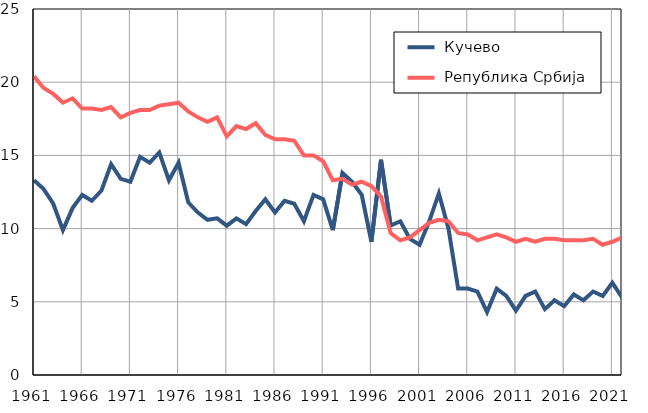
| Category |  Кучево |  Република Србија |
|---|---|---|
| 1961.0 | 13.3 | 20.4 |
| 1962.0 | 12.7 | 19.6 |
| 1963.0 | 11.7 | 19.2 |
| 1964.0 | 9.9 | 18.6 |
| 1965.0 | 11.4 | 18.9 |
| 1966.0 | 12.3 | 18.2 |
| 1967.0 | 11.9 | 18.2 |
| 1968.0 | 12.6 | 18.1 |
| 1969.0 | 14.4 | 18.3 |
| 1970.0 | 13.4 | 17.6 |
| 1971.0 | 13.2 | 17.9 |
| 1972.0 | 14.9 | 18.1 |
| 1973.0 | 14.5 | 18.1 |
| 1974.0 | 15.2 | 18.4 |
| 1975.0 | 13.3 | 18.5 |
| 1976.0 | 14.5 | 18.6 |
| 1977.0 | 11.8 | 18 |
| 1978.0 | 11.1 | 17.6 |
| 1979.0 | 10.6 | 17.3 |
| 1980.0 | 10.7 | 17.6 |
| 1981.0 | 10.2 | 16.3 |
| 1982.0 | 10.7 | 17 |
| 1983.0 | 10.3 | 16.8 |
| 1984.0 | 11.2 | 17.2 |
| 1985.0 | 12 | 16.4 |
| 1986.0 | 11.1 | 16.1 |
| 1987.0 | 11.9 | 16.1 |
| 1988.0 | 11.7 | 16 |
| 1989.0 | 10.5 | 15 |
| 1990.0 | 12.3 | 15 |
| 1991.0 | 12 | 14.6 |
| 1992.0 | 9.9 | 13.3 |
| 1993.0 | 13.8 | 13.4 |
| 1994.0 | 13.2 | 13 |
| 1995.0 | 12.3 | 13.2 |
| 1996.0 | 9.1 | 12.9 |
| 1997.0 | 14.7 | 12.2 |
| 1998.0 | 10.2 | 9.7 |
| 1999.0 | 10.5 | 9.2 |
| 2000.0 | 9.3 | 9.4 |
| 2001.0 | 8.9 | 9.9 |
| 2002.0 | 10.5 | 10.4 |
| 2003.0 | 12.4 | 10.6 |
| 2004.0 | 10 | 10.5 |
| 2005.0 | 5.9 | 9.7 |
| 2006.0 | 5.9 | 9.6 |
| 2007.0 | 5.7 | 9.2 |
| 2008.0 | 4.3 | 9.4 |
| 2009.0 | 5.9 | 9.6 |
| 2010.0 | 5.4 | 9.4 |
| 2011.0 | 4.4 | 9.1 |
| 2012.0 | 5.4 | 9.3 |
| 2013.0 | 5.7 | 9.1 |
| 2014.0 | 4.5 | 9.3 |
| 2015.0 | 5.1 | 9.3 |
| 2016.0 | 4.7 | 9.2 |
| 2017.0 | 5.5 | 9.2 |
| 2018.0 | 5.1 | 9.2 |
| 2019.0 | 5.7 | 9.3 |
| 2020.0 | 5.4 | 8.9 |
| 2021.0 | 6.3 | 9.1 |
| 2022.0 | 5.3 | 9.4 |